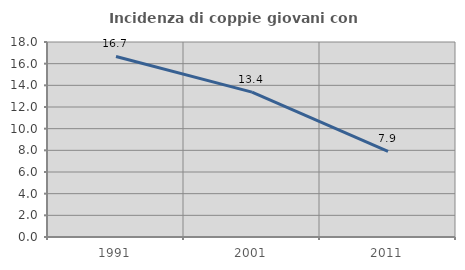
| Category | Incidenza di coppie giovani con figli |
|---|---|
| 1991.0 | 16.667 |
| 2001.0 | 13.377 |
| 2011.0 | 7.903 |